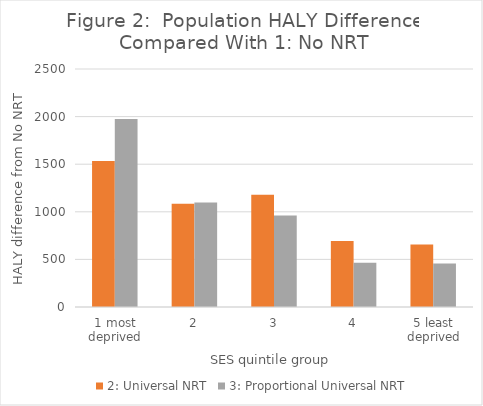
| Category | 2: Universal NRT | 3: Proportional Universal NRT |
|---|---|---|
| 1 most deprived | 1532.351 | 1974.958 |
| 2 | 1083.449 | 1096.929 |
| 3 | 1180.1 | 960.415 |
| 4 | 694.154 | 464.693 |
| 5 least deprived | 656.218 | 457.749 |